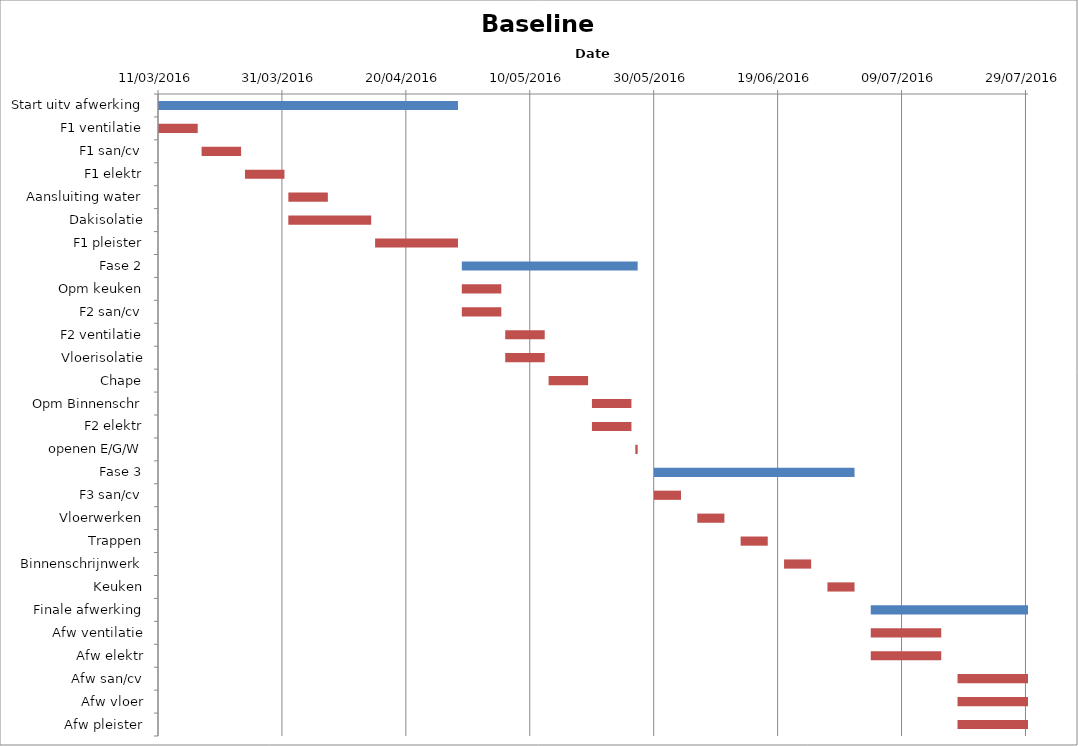
| Category | Baseline start | Actual duration |
|---|---|---|
| Start uitv afwerking | 42440.333 | 48.375 |
| F1 ventilatie | 42440.333 | 6.375 |
| F1 san/cv | 42447.333 | 6.375 |
| F1 elektr | 42454.333 | 6.375 |
| Aansluiting water | 42461.333 | 6.375 |
| Dakisolatie | 42461.333 | 13.375 |
| F1 pleister | 42475.333 | 13.375 |
| Fase 2 | 42489.333 | 28.375 |
| Opm keuken | 42489.333 | 6.375 |
| F2 san/cv | 42489.333 | 6.375 |
| F2 ventilatie | 42496.333 | 6.375 |
| Vloerisolatie | 42496.333 | 6.375 |
| Chape | 42503.333 | 6.375 |
| Opm Binnenschr | 42510.333 | 6.375 |
| F2 elektr | 42510.333 | 6.375 |
| openen E/G/W | 42517.333 | 0.375 |
| Fase 3 | 42520.333 | 32.375 |
| F3 san/cv | 42520.333 | 4.375 |
| Vloerwerken | 42527.333 | 4.375 |
| Trappen | 42534.333 | 4.375 |
| Binnenschrijnwerk | 42541.333 | 4.375 |
| Keuken | 42548.333 | 4.375 |
| Finale afwerking | 42555.333 | 25.375 |
| Afw ventilatie | 42555.333 | 11.375 |
| Afw elektr | 42555.333 | 11.375 |
| Afw san/cv | 42569.333 | 11.375 |
| Afw vloer | 42569.333 | 11.375 |
| Afw pleister | 42569.333 | 11.375 |